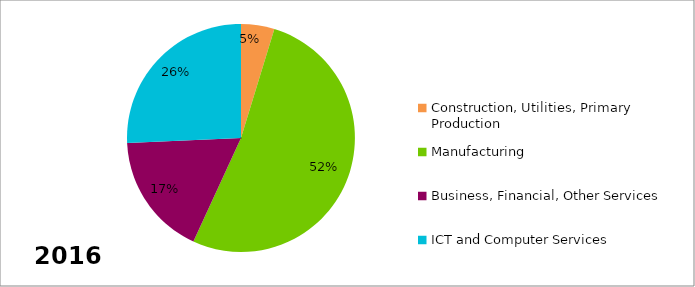
| Category | Series 0 |
|---|---|
| Construction, Utilities, Primary Production | 0.047 |
| Manufacturing | 0.521 |
| Business, Financial, Other Services | 0.174 |
| ICT and Computer Services | 0.257 |